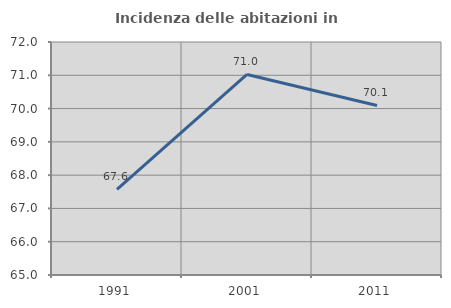
| Category | Incidenza delle abitazioni in proprietà  |
|---|---|
| 1991.0 | 67.573 |
| 2001.0 | 71.024 |
| 2011.0 | 70.092 |